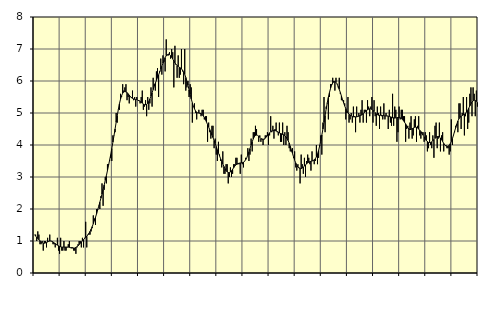
| Category | Piggar | Series 1 |
|---|---|---|
| nan | 1.2 | 1.2 |
| 87.0 | 1.2 | 1.15 |
| 87.0 | 1 | 1.12 |
| 87.0 | 1.3 | 1.08 |
| 87.0 | 1.2 | 1.04 |
| 87.0 | 0.9 | 1.01 |
| 87.0 | 0.9 | 0.97 |
| 87.0 | 1 | 0.95 |
| 87.0 | 0.7 | 0.93 |
| 87.0 | 1 | 0.93 |
| 87.0 | 1 | 0.94 |
| 87.0 | 0.8 | 0.95 |
| nan | 1.1 | 0.97 |
| 88.0 | 1 | 0.99 |
| 88.0 | 1.2 | 1 |
| 88.0 | 1 | 1 |
| 88.0 | 1 | 0.99 |
| 88.0 | 0.9 | 0.97 |
| 88.0 | 0.9 | 0.94 |
| 88.0 | 0.8 | 0.92 |
| 88.0 | 0.9 | 0.89 |
| 88.0 | 1.1 | 0.87 |
| 88.0 | 0.7 | 0.85 |
| 88.0 | 0.6 | 0.83 |
| nan | 1.1 | 0.82 |
| 89.0 | 0.7 | 0.81 |
| 89.0 | 0.7 | 0.81 |
| 89.0 | 1 | 0.81 |
| 89.0 | 0.7 | 0.81 |
| 89.0 | 0.7 | 0.81 |
| 89.0 | 0.8 | 0.81 |
| 89.0 | 0.9 | 0.81 |
| 89.0 | 1 | 0.8 |
| 89.0 | 0.8 | 0.79 |
| 89.0 | 0.8 | 0.78 |
| 89.0 | 0.8 | 0.78 |
| nan | 0.7 | 0.78 |
| 90.0 | 0.7 | 0.78 |
| 90.0 | 0.6 | 0.8 |
| 90.0 | 0.8 | 0.82 |
| 90.0 | 0.9 | 0.85 |
| 90.0 | 1 | 0.89 |
| 90.0 | 1 | 0.93 |
| 90.0 | 0.8 | 0.97 |
| 90.0 | 1.1 | 1.01 |
| 90.0 | 0.8 | 1.04 |
| 90.0 | 1.1 | 1.08 |
| 90.0 | 1.6 | 1.11 |
| nan | 0.8 | 1.15 |
| 91.0 | 1.2 | 1.19 |
| 91.0 | 1.2 | 1.24 |
| 91.0 | 1.2 | 1.3 |
| 91.0 | 1.3 | 1.37 |
| 91.0 | 1.4 | 1.45 |
| 91.0 | 1.8 | 1.54 |
| 91.0 | 1.7 | 1.64 |
| 91.0 | 1.5 | 1.74 |
| 91.0 | 2 | 1.85 |
| 91.0 | 2 | 1.97 |
| 91.0 | 2.1 | 2.09 |
| nan | 2 | 2.21 |
| 92.0 | 2.4 | 2.34 |
| 92.0 | 2.8 | 2.47 |
| 92.0 | 2.1 | 2.61 |
| 92.0 | 2.6 | 2.75 |
| 92.0 | 3 | 2.9 |
| 92.0 | 2.8 | 3.04 |
| 92.0 | 3.4 | 3.2 |
| 92.0 | 3.4 | 3.36 |
| 92.0 | 3.5 | 3.53 |
| 92.0 | 3.6 | 3.7 |
| 92.0 | 3.5 | 3.89 |
| nan | 4.3 | 4.09 |
| 93.0 | 4.3 | 4.29 |
| 93.0 | 4.4 | 4.5 |
| 93.0 | 5 | 4.71 |
| 93.0 | 4.7 | 4.92 |
| 93.0 | 5.1 | 5.11 |
| 93.0 | 5.1 | 5.29 |
| 93.0 | 5.6 | 5.43 |
| 93.0 | 5.5 | 5.54 |
| 93.0 | 5.9 | 5.62 |
| 93.0 | 5.7 | 5.66 |
| 93.0 | 5.8 | 5.67 |
| nan | 5.9 | 5.66 |
| 94.0 | 5.4 | 5.64 |
| 94.0 | 5.5 | 5.6 |
| 94.0 | 5.3 | 5.56 |
| 94.0 | 5.5 | 5.51 |
| 94.0 | 5.5 | 5.48 |
| 94.0 | 5.7 | 5.46 |
| 94.0 | 5.4 | 5.44 |
| 94.0 | 5.5 | 5.43 |
| 94.0 | 5.2 | 5.42 |
| 94.0 | 5.5 | 5.42 |
| 94.0 | 5.4 | 5.4 |
| nan | 5.4 | 5.38 |
| 95.0 | 5.3 | 5.36 |
| 95.0 | 5.5 | 5.33 |
| 95.0 | 5.7 | 5.31 |
| 95.0 | 5.1 | 5.28 |
| 95.0 | 5.2 | 5.26 |
| 95.0 | 5.4 | 5.26 |
| 95.0 | 4.9 | 5.27 |
| 95.0 | 5.5 | 5.3 |
| 95.0 | 5.1 | 5.36 |
| 95.0 | 5.3 | 5.44 |
| 95.0 | 5.8 | 5.53 |
| nan | 5.2 | 5.63 |
| 96.0 | 6.1 | 5.73 |
| 96.0 | 5.9 | 5.84 |
| 96.0 | 5.7 | 5.93 |
| 96.0 | 6.3 | 6.02 |
| 96.0 | 6.4 | 6.11 |
| 96.0 | 5.5 | 6.19 |
| 96.0 | 6.3 | 6.28 |
| 96.0 | 6.7 | 6.37 |
| 96.0 | 6.2 | 6.46 |
| 96.0 | 6.8 | 6.56 |
| 96.0 | 6.6 | 6.65 |
| nan | 6.3 | 6.73 |
| 97.0 | 7.3 | 6.79 |
| 97.0 | 6.8 | 6.82 |
| 97.0 | 6.8 | 6.84 |
| 97.0 | 6.9 | 6.83 |
| 97.0 | 6.7 | 6.79 |
| 97.0 | 7 | 6.74 |
| 97.0 | 6.9 | 6.69 |
| 97.0 | 5.8 | 6.62 |
| 97.0 | 7.1 | 6.57 |
| 97.0 | 6.5 | 6.52 |
| 97.0 | 6.1 | 6.48 |
| nan | 6.8 | 6.46 |
| 98.0 | 6.1 | 6.43 |
| 98.0 | 6.2 | 6.41 |
| 98.0 | 7 | 6.38 |
| 98.0 | 6.3 | 6.34 |
| 98.0 | 5.9 | 6.28 |
| 98.0 | 7 | 6.21 |
| 98.0 | 5.7 | 6.11 |
| 98.0 | 5.8 | 5.99 |
| 98.0 | 6 | 5.87 |
| 98.0 | 5.5 | 5.72 |
| 98.0 | 5.9 | 5.58 |
| nan | 5.8 | 5.44 |
| 99.0 | 4.7 | 5.32 |
| 99.0 | 5.2 | 5.21 |
| 99.0 | 5.3 | 5.13 |
| 99.0 | 5 | 5.06 |
| 99.0 | 4.8 | 5.03 |
| 99.0 | 5 | 5 |
| 99.0 | 5.1 | 5 |
| 99.0 | 5 | 4.99 |
| 99.0 | 4.9 | 4.98 |
| 99.0 | 5.1 | 4.95 |
| 99.0 | 5.1 | 4.91 |
| nan | 4.8 | 4.86 |
| 0.0 | 4.9 | 4.79 |
| 0.0 | 4.9 | 4.72 |
| 0.0 | 4.1 | 4.64 |
| 0.0 | 4.7 | 4.56 |
| 0.0 | 4.4 | 4.48 |
| 0.0 | 4.2 | 4.4 |
| 0.0 | 4.6 | 4.31 |
| 0.0 | 4.6 | 4.23 |
| 0.0 | 3.9 | 4.14 |
| 0.0 | 4.2 | 4.05 |
| 0.0 | 3.7 | 3.95 |
| nan | 3.5 | 3.85 |
| 1.0 | 4.1 | 3.75 |
| 1.0 | 3.7 | 3.66 |
| 1.0 | 3.5 | 3.57 |
| 1.0 | 3.3 | 3.49 |
| 1.0 | 3.8 | 3.41 |
| 1.0 | 3.1 | 3.33 |
| 1.0 | 3.1 | 3.26 |
| 1.0 | 3.4 | 3.2 |
| 1.0 | 3.4 | 3.16 |
| 1.0 | 2.8 | 3.14 |
| 1.0 | 3 | 3.14 |
| nan | 3.3 | 3.16 |
| 2.0 | 3 | 3.19 |
| 2.0 | 3.1 | 3.24 |
| 2.0 | 3.4 | 3.29 |
| 2.0 | 3.4 | 3.34 |
| 2.0 | 3.6 | 3.38 |
| 2.0 | 3.6 | 3.4 |
| 2.0 | 3.4 | 3.42 |
| 2.0 | 3.4 | 3.43 |
| 2.0 | 3.1 | 3.44 |
| 2.0 | 3.7 | 3.44 |
| 2.0 | 3.4 | 3.45 |
| nan | 3.3 | 3.46 |
| 3.0 | 3.5 | 3.49 |
| 3.0 | 3.6 | 3.54 |
| 3.0 | 3.6 | 3.6 |
| 3.0 | 3.9 | 3.69 |
| 3.0 | 3.5 | 3.78 |
| 3.0 | 3.7 | 3.89 |
| 3.0 | 4.2 | 4 |
| 3.0 | 3.8 | 4.1 |
| 3.0 | 4.4 | 4.19 |
| 3.0 | 4.4 | 4.26 |
| 3.0 | 4.6 | 4.3 |
| nan | 4.5 | 4.31 |
| 4.0 | 4.3 | 4.3 |
| 4.0 | 4.1 | 4.28 |
| 4.0 | 4.3 | 4.24 |
| 4.0 | 4.1 | 4.2 |
| 4.0 | 4.2 | 4.18 |
| 4.0 | 4 | 4.17 |
| 4.0 | 4.2 | 4.18 |
| 4.0 | 4.3 | 4.21 |
| 4.0 | 4.3 | 4.25 |
| 4.0 | 4.4 | 4.29 |
| 4.0 | 4 | 4.34 |
| nan | 4.3 | 4.38 |
| 5.0 | 4.9 | 4.42 |
| 5.0 | 4.4 | 4.44 |
| 5.0 | 4.6 | 4.45 |
| 5.0 | 4.2 | 4.46 |
| 5.0 | 4.5 | 4.45 |
| 5.0 | 4.7 | 4.44 |
| 5.0 | 4.4 | 4.42 |
| 5.0 | 4.3 | 4.4 |
| 5.0 | 4.7 | 4.38 |
| 5.0 | 4.1 | 4.36 |
| 5.0 | 4.1 | 4.35 |
| nan | 4.7 | 4.33 |
| 6.0 | 4 | 4.32 |
| 6.0 | 4.4 | 4.29 |
| 6.0 | 4 | 4.25 |
| 6.0 | 4.6 | 4.2 |
| 6.0 | 4.4 | 4.14 |
| 6.0 | 3.9 | 4.06 |
| 6.0 | 3.8 | 3.96 |
| 6.0 | 3.8 | 3.85 |
| 6.0 | 3.9 | 3.74 |
| 6.0 | 3.6 | 3.63 |
| 6.0 | 3.8 | 3.53 |
| nan | 3.3 | 3.44 |
| 7.0 | 3.2 | 3.36 |
| 7.0 | 3.4 | 3.31 |
| 7.0 | 3.3 | 3.28 |
| 7.0 | 2.8 | 3.26 |
| 7.0 | 3.7 | 3.26 |
| 7.0 | 3.4 | 3.28 |
| 7.0 | 3.1 | 3.31 |
| 7.0 | 3.6 | 3.34 |
| 7.0 | 3 | 3.38 |
| 7.0 | 3.5 | 3.41 |
| 7.0 | 3.7 | 3.44 |
| nan | 3.6 | 3.46 |
| 8.0 | 3.4 | 3.48 |
| 8.0 | 3.2 | 3.49 |
| 8.0 | 3.8 | 3.5 |
| 8.0 | 3.5 | 3.51 |
| 8.0 | 3.4 | 3.54 |
| 8.0 | 3.5 | 3.57 |
| 8.0 | 4 | 3.63 |
| 8.0 | 3.4 | 3.72 |
| 8.0 | 3.6 | 3.83 |
| 8.0 | 4 | 3.97 |
| 8.0 | 4.3 | 4.13 |
| nan | 3.7 | 4.31 |
| 9.0 | 4.7 | 4.5 |
| 9.0 | 5.5 | 4.71 |
| 9.0 | 4.4 | 4.92 |
| 9.0 | 5.2 | 5.13 |
| 9.0 | 5.3 | 5.32 |
| 9.0 | 4.8 | 5.49 |
| 9.0 | 5.5 | 5.64 |
| 9.0 | 5.9 | 5.77 |
| 9.0 | 5.9 | 5.87 |
| 9.0 | 6.1 | 5.94 |
| 9.0 | 6 | 5.97 |
| nan | 5.7 | 5.98 |
| 10.0 | 6.1 | 5.96 |
| 10.0 | 5.9 | 5.91 |
| 10.0 | 5.8 | 5.83 |
| 10.0 | 6.1 | 5.74 |
| 10.0 | 5.6 | 5.64 |
| 10.0 | 5.4 | 5.53 |
| 10.0 | 5.4 | 5.42 |
| 10.0 | 5.4 | 5.32 |
| 10.0 | 5.3 | 5.22 |
| 10.0 | 4.8 | 5.14 |
| 10.0 | 5 | 5.06 |
| nan | 5.5 | 5.01 |
| 11.0 | 4.7 | 4.96 |
| 11.0 | 4.8 | 4.93 |
| 11.0 | 5 | 4.91 |
| 11.0 | 4.7 | 4.89 |
| 11.0 | 5.2 | 4.88 |
| 11.0 | 4.9 | 4.88 |
| 11.0 | 4.4 | 4.88 |
| 11.0 | 5.2 | 4.88 |
| 11.0 | 4.9 | 4.89 |
| 11.0 | 5 | 4.9 |
| 11.0 | 4.7 | 4.92 |
| nan | 5.1 | 4.93 |
| 12.0 | 5.4 | 4.95 |
| 12.0 | 4.7 | 4.98 |
| 12.0 | 5.1 | 5.01 |
| 12.0 | 5.1 | 5.05 |
| 12.0 | 4.7 | 5.08 |
| 12.0 | 5.4 | 5.1 |
| 12.0 | 5.2 | 5.12 |
| 12.0 | 4.9 | 5.13 |
| 12.0 | 5.2 | 5.13 |
| 12.0 | 5.5 | 5.11 |
| 12.0 | 4.7 | 5.08 |
| nan | 5.4 | 5.05 |
| 13.0 | 4.9 | 5.01 |
| 13.0 | 4.6 | 4.97 |
| 13.0 | 5.2 | 4.95 |
| 13.0 | 5 | 4.93 |
| 13.0 | 4.5 | 4.93 |
| 13.0 | 5.2 | 4.93 |
| 13.0 | 4.9 | 4.93 |
| 13.0 | 4.8 | 4.92 |
| 13.0 | 5.3 | 4.92 |
| 13.0 | 4.8 | 4.91 |
| 13.0 | 5 | 4.91 |
| nan | 4.9 | 4.91 |
| 14.0 | 4.5 | 4.9 |
| 14.0 | 5.1 | 4.89 |
| 14.0 | 4.7 | 4.88 |
| 14.0 | 4.6 | 4.87 |
| 14.0 | 5.6 | 4.85 |
| 14.0 | 4.6 | 4.85 |
| 14.0 | 5.2 | 4.84 |
| 14.0 | 5.1 | 4.85 |
| 14.0 | 4.1 | 4.85 |
| 14.0 | 4.4 | 4.86 |
| 14.0 | 5.2 | 4.86 |
| nan | 4.8 | 4.85 |
| 15.0 | 5.1 | 4.83 |
| 15.0 | 5.1 | 4.8 |
| 15.0 | 4.9 | 4.76 |
| 15.0 | 4.9 | 4.71 |
| 15.0 | 4.1 | 4.66 |
| 15.0 | 4.5 | 4.59 |
| 15.0 | 4.6 | 4.54 |
| 15.0 | 4.2 | 4.5 |
| 15.0 | 4.7 | 4.48 |
| 15.0 | 4.9 | 4.49 |
| 15.0 | 4.2 | 4.51 |
| nan | 4.3 | 4.53 |
| 16.0 | 4.8 | 4.55 |
| 16.0 | 4.9 | 4.56 |
| 16.0 | 4.1 | 4.55 |
| 16.0 | 4.6 | 4.53 |
| 16.0 | 4.9 | 4.5 |
| 16.0 | 4.3 | 4.46 |
| 16.0 | 4.2 | 4.42 |
| 16.0 | 4.4 | 4.36 |
| 16.0 | 4.4 | 4.31 |
| 16.0 | 4.1 | 4.25 |
| 16.0 | 4.4 | 4.19 |
| nan | 4.3 | 4.14 |
| 17.0 | 3.8 | 4.11 |
| 17.0 | 3.9 | 4.08 |
| 17.0 | 4.4 | 4.08 |
| 17.0 | 4 | 4.08 |
| 17.0 | 3.9 | 4.1 |
| 17.0 | 4.3 | 4.13 |
| 17.0 | 3.6 | 4.17 |
| 17.0 | 4.6 | 4.21 |
| 17.0 | 4.7 | 4.24 |
| 17.0 | 3.9 | 4.26 |
| 17.0 | 4.2 | 4.27 |
| nan | 4.7 | 4.25 |
| 18.0 | 3.8 | 4.22 |
| 18.0 | 4.3 | 4.17 |
| 18.0 | 4.4 | 4.11 |
| 18.0 | 3.8 | 4.05 |
| 18.0 | 4 | 4 |
| 18.0 | 4 | 3.97 |
| 18.0 | 3.9 | 3.96 |
| 18.0 | 3.9 | 3.96 |
| 18.0 | 3.7 | 3.99 |
| 18.0 | 3.8 | 4.04 |
| 18.0 | 4.8 | 4.11 |
| nan | 4 | 4.2 |
| 19.0 | 4.3 | 4.31 |
| 19.0 | 4.4 | 4.43 |
| 19.0 | 4.6 | 4.54 |
| 19.0 | 4.6 | 4.65 |
| 19.0 | 4.4 | 4.75 |
| 19.0 | 5.3 | 4.82 |
| 19.0 | 5.3 | 4.87 |
| 19.0 | 4.5 | 4.9 |
| 19.0 | 5 | 4.92 |
| 19.0 | 5.5 | 4.94 |
| 19.0 | 4.3 | 4.96 |
| nan | 4.9 | 4.99 |
| 20.0 | 5.5 | 5.03 |
| 20.0 | 4.5 | 5.08 |
| 20.0 | 4.7 | 5.15 |
| 20.0 | 5.6 | 5.22 |
| 20.0 | 5.8 | 5.29 |
| 20.0 | 4.9 | 5.34 |
| 20.0 | 5.8 | 5.38 |
| 20.0 | 5.6 | 5.4 |
| 20.0 | 4.9 | 5.39 |
| 20.0 | 5.7 | 5.37 |
| 20.0 | 5.2 | 5.33 |